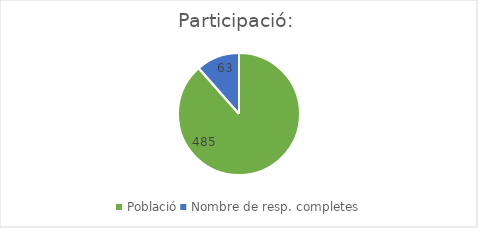
| Category | Series 0 |
|---|---|
| Població | 485 |
| Nombre de resp. completes | 63 |